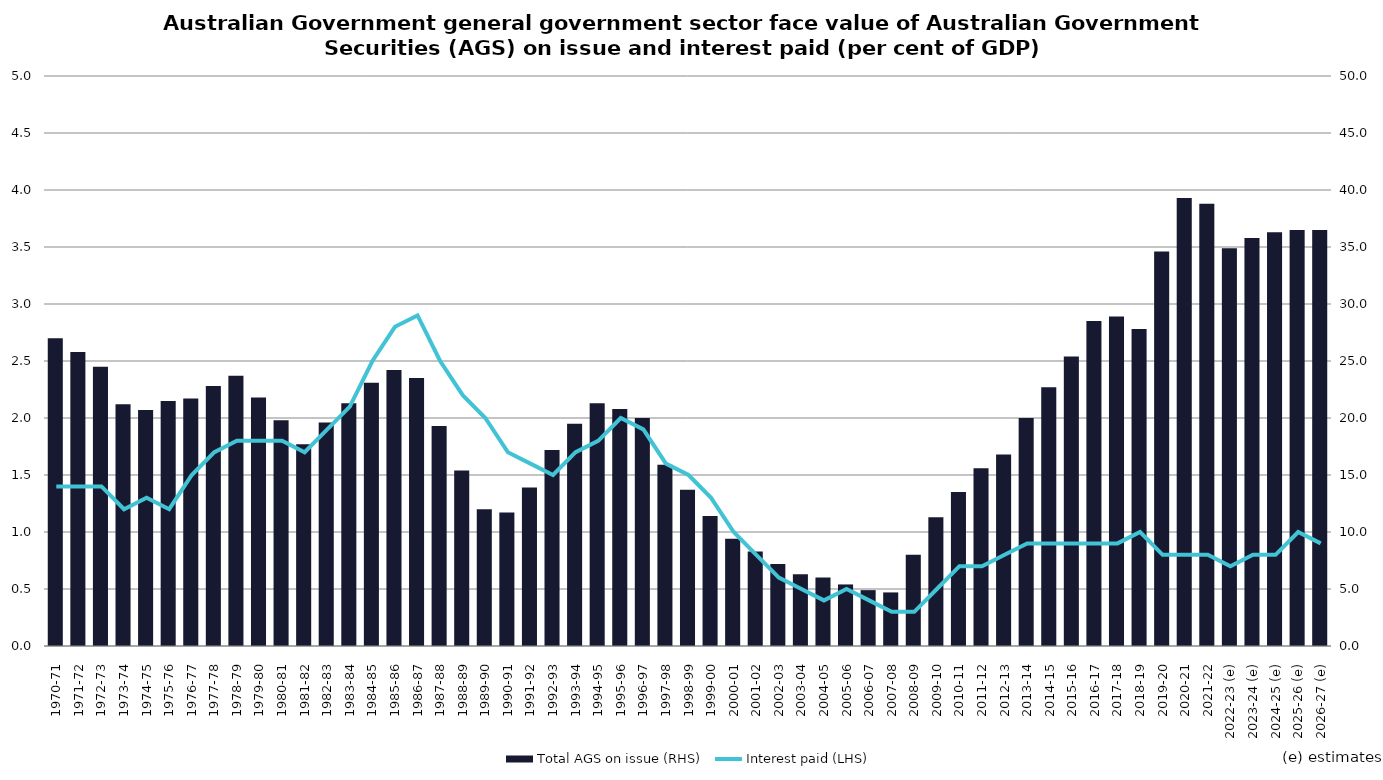
| Category | Total AGS on issue (RHS) |
|---|---|
| 1970-71 | 27 |
| 1971-72 | 25.8 |
| 1972-73 | 24.5 |
| 1973-74 | 21.2 |
| 1974-75 | 20.7 |
| 1975-76 | 21.5 |
| 1976-77 | 21.7 |
| 1977-78 | 22.8 |
| 1978-79 | 23.7 |
| 1979-80 | 21.8 |
| 1980-81 | 19.8 |
| 1981-82 | 17.7 |
| 1982-83 | 19.6 |
| 1983-84 | 21.3 |
| 1984-85 | 23.1 |
| 1985-86 | 24.2 |
| 1986-87 | 23.5 |
| 1987-88 | 19.3 |
| 1988-89 | 15.4 |
| 1989-90 | 12 |
| 1990-91 | 11.7 |
| 1991-92 | 13.9 |
| 1992-93 | 17.2 |
| 1993-94 | 19.5 |
| 1994-95 | 21.3 |
| 1995-96 | 20.8 |
| 1996-97 | 20 |
| 1997-98 | 15.9 |
| 1998-99 | 13.7 |
| 1999-00 | 11.4 |
| 2000-01 | 9.4 |
| 2001-02 | 8.3 |
| 2002-03 | 7.2 |
| 2003-04 | 6.3 |
| 2004-05 | 6 |
| 2005-06 | 5.4 |
| 2006-07 | 4.9 |
| 2007-08 | 4.7 |
| 2008-09 | 8 |
| 2009-10 | 11.3 |
| 2010-11 | 13.5 |
| 2011-12 | 15.6 |
| 2012-13 | 16.8 |
| 2013-14 | 20 |
| 2014-15 | 22.7 |
| 2015-16 | 25.4 |
| 2016-17 | 28.5 |
| 2017-18 | 28.9 |
| 2018-19 | 27.8 |
| 2019-20 | 34.6 |
| 2020-21 | 39.3 |
| 2021-22 | 38.8 |
| 2022-23 (e) | 34.9 |
| 2023-24 (e) | 35.8 |
| 2024-25 (e) | 36.3 |
| 2025-26 (e) | 36.5 |
| 2026-27 (e) | 36.5 |